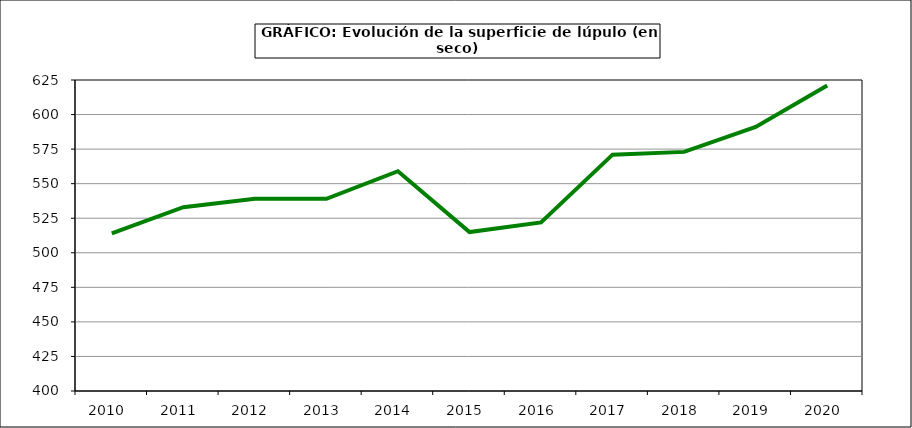
| Category | Superficie |
|---|---|
| 2010.0 | 514 |
| 2011.0 | 533 |
| 2012.0 | 539 |
| 2013.0 | 539 |
| 2014.0 | 559 |
| 2015.0 | 515 |
| 2016.0 | 522 |
| 2017.0 | 571 |
| 2018.0 | 573 |
| 2019.0 | 591 |
| 2020.0 | 621 |